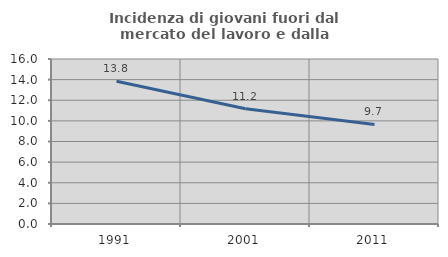
| Category | Incidenza di giovani fuori dal mercato del lavoro e dalla formazione  |
|---|---|
| 1991.0 | 13.836 |
| 2001.0 | 11.168 |
| 2011.0 | 9.659 |